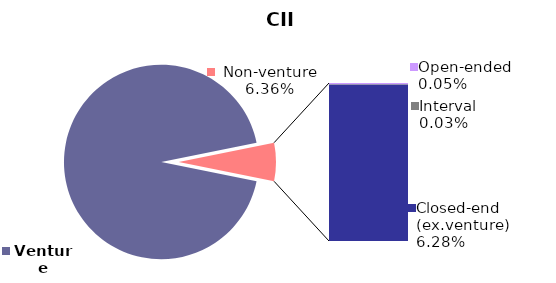
| Category | 30.09.2021 |
|---|---|
| Venture | 0.936 |
| Open-ended | 0 |
| Interval | 0 |
| Closed-end (ex.venture) | 0.063 |